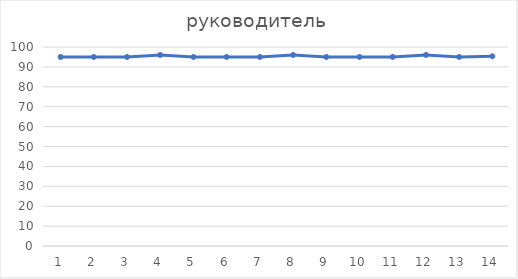
| Category | Series 0 |
|---|---|
| 0 | 95 |
| 1 | 95 |
| 2 | 95 |
| 3 | 96 |
| 4 | 95 |
| 5 | 95 |
| 6 | 95 |
| 7 | 96 |
| 8 | 95 |
| 9 | 95 |
| 10 | 95 |
| 11 | 96 |
| 12 | 95 |
| 13 | 95.34 |